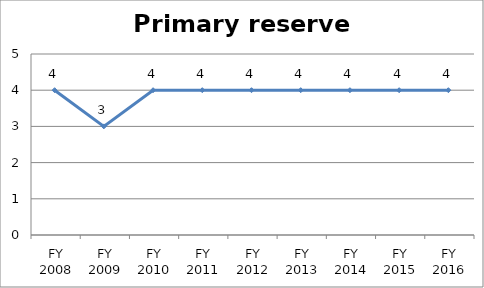
| Category | Primary reserve score |
|---|---|
| FY 2016 | 4 |
| FY 2015 | 4 |
| FY 2014 | 4 |
| FY 2013 | 4 |
| FY 2012 | 4 |
| FY 2011 | 4 |
| FY 2010 | 4 |
| FY 2009 | 3 |
| FY 2008 | 4 |